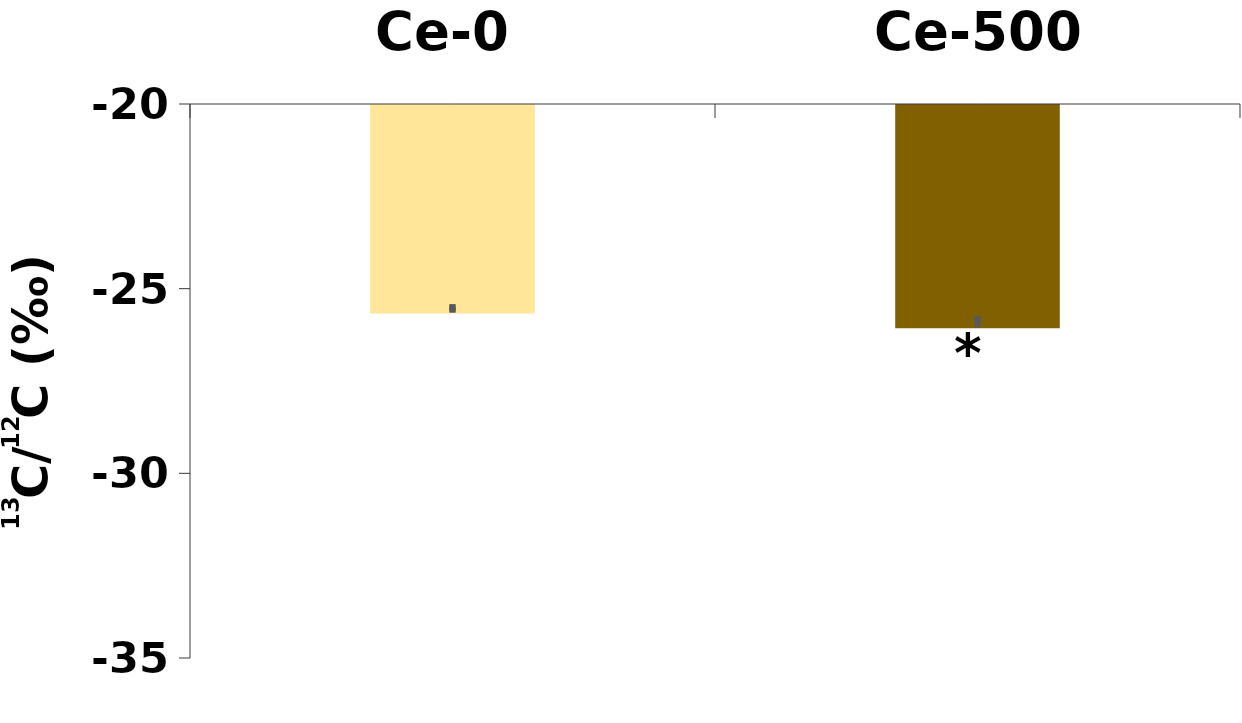
| Category | δ13C |
|---|---|
| Ce-0 | -25.645 |
| Ce-500 | -26.042 |